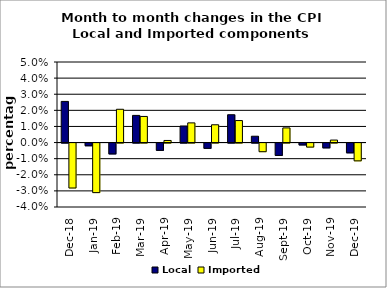
| Category | Local | Imported |
|---|---|---|
| 2018-12-01 | 0.026 | -0.028 |
| 2019-01-01 | -0.002 | -0.031 |
| 2019-02-01 | -0.007 | 0.021 |
| 2019-03-01 | 0.017 | 0.016 |
| 2019-04-01 | -0.005 | 0.001 |
| 2019-05-01 | 0.01 | 0.012 |
| 2019-06-01 | -0.003 | 0.011 |
| 2019-07-01 | 0.017 | 0.014 |
| 2019-08-01 | 0.004 | -0.005 |
| 2019-09-01 | -0.008 | 0.009 |
| 2019-10-01 | -0.001 | -0.003 |
| 2019-11-01 | -0.003 | 0.002 |
| 2019-12-01 | -0.006 | -0.011 |